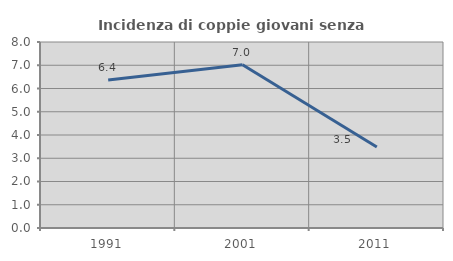
| Category | Incidenza di coppie giovani senza figli |
|---|---|
| 1991.0 | 6.369 |
| 2001.0 | 7.021 |
| 2011.0 | 3.486 |